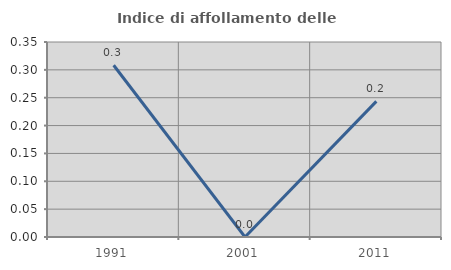
| Category | Indice di affollamento delle abitazioni  |
|---|---|
| 1991.0 | 0.308 |
| 2001.0 | 0 |
| 2011.0 | 0.244 |